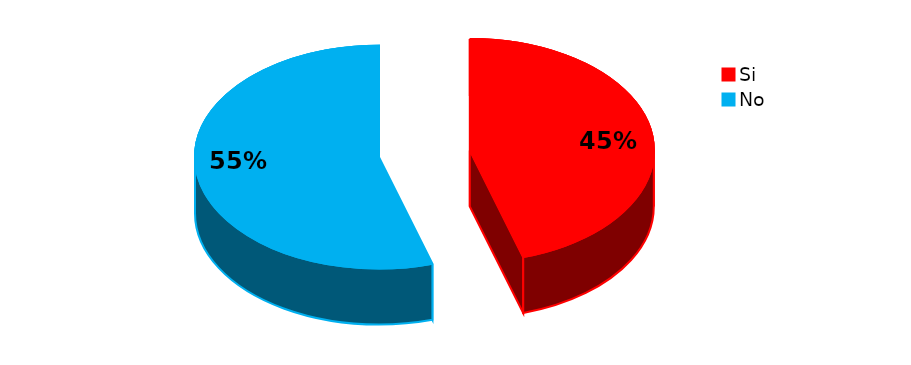
| Category | Series 0 |
|---|---|
| Si | 58 |
| No | 70 |